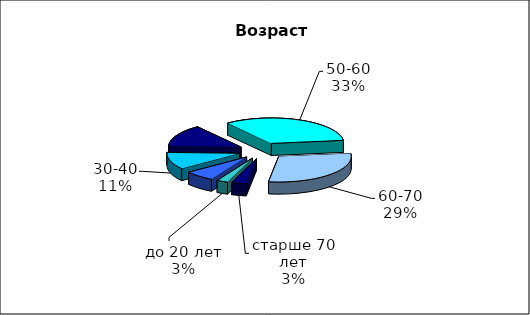
| Category | Series 0 |
|---|---|
| до 20 лет | 30 |
| 20-30 | 80 |
| 30-40 | 130 |
| 40-50 | 170 |
| 50-60 | 400 |
| 60-70 | 350 |
| старше 70 лет | 40 |